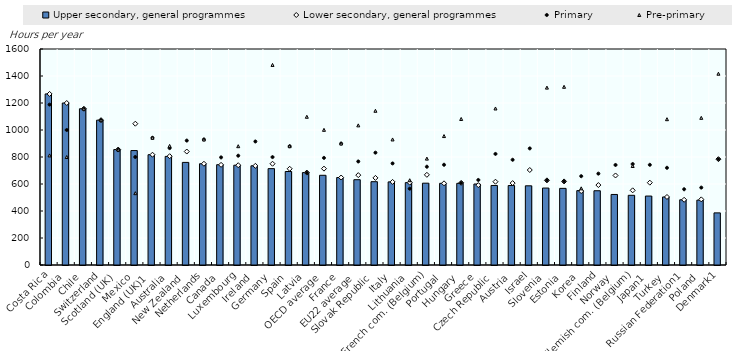
| Category | Upper secondary, general programmes |
|---|---|
| Costa Rica | 1267.2 |
| Colombia | 1200 |
| Chile | 1157.36 |
| Switzerland | 1073 |
| Scotland (UK) | 855 |
| Mexico | 847.7 |
| England (UK)1 | 817 |
| Australia | 804.483 |
| New Zealand | 760 |
| Netherlands | 750 |
| Canada | 742.973 |
| Luxembourg | 739.2 |
| Ireland | 734.8 |
| Germany | 713.887 |
| Spain | 692.55 |
| Latvia | 684.6 |
| OECD average | 664.471 |
| France | 648 |
| EU22 average | 631.807 |
| Slovak Republic | 617.1 |
| Italy | 615.6 |
| Lithuania | 610.2 |
| French com. (Belgium) | 606.06 |
| Portugal | 605 |
| Hungary | 604.8 |
| Greece | 599.78 |
| Czech Republic | 589.05 |
| Austria | 588.6 |
| Israel | 586.655 |
| Slovenia | 570 |
| Estonia | 567.6 |
| Korea | 551.013 |
| Finland | 550.088 |
| Norway | 522.5 |
| Flemish com. (Belgium) | 516.25 |
| Japan1 | 510.757 |
| Turkey | 504 |
| Russian Federation1 | 483 |
| Poland | 480.6 |
| Denmark1 | 386 |